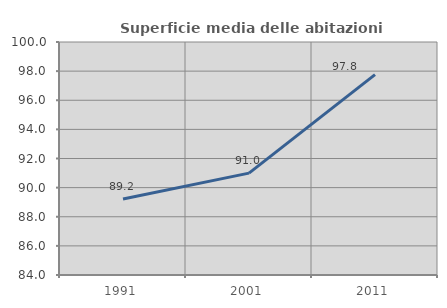
| Category | Superficie media delle abitazioni occupate |
|---|---|
| 1991.0 | 89.213 |
| 2001.0 | 90.996 |
| 2011.0 | 97.755 |